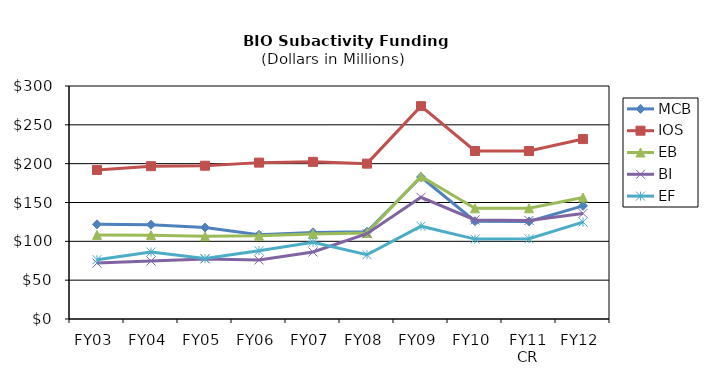
| Category | MCB | IOS | EB | BI | EF |
|---|---|---|---|---|---|
| FY03 | 121.89 | 191.92 | 108.28 | 72.03 | 76.37 |
| FY04 | 121.42 | 196.76 | 107.94 | 74.68 | 86.24 |
| FY05 | 117.74 | 197.36 | 106.47 | 77.41 | 77.8 |
| FY06 | 108.46 | 201.34 | 107.21 | 76.02 | 87.87 |
| FY07 | 111.5 | 202.31 | 109.6 | 86.21 | 98.92 |
| FY08 | 112.28 | 200.04 | 110.71 | 109.86 | 82.73 |
| FY09 | 182.81 | 274.05 | 183.6 | 156.69 | 119.48 |
| FY10 | 125.9 | 216.32 | 142.5 | 127.54 | 102.85 |
| FY11
CR | 125.59 | 216.25 | 142.55 | 126.86 | 103.29 |
| FY12 | 145.72 | 231.65 | 156.4 | 135.95 | 124.77 |